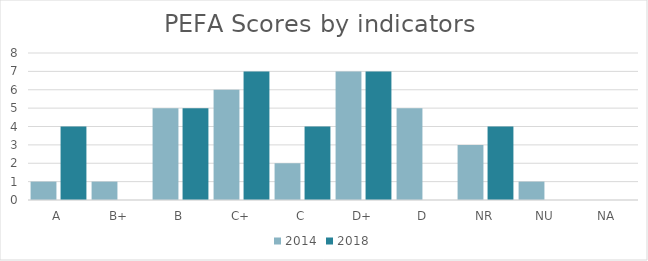
| Category | 2014 | 2018 |
|---|---|---|
| A | 1 | 4 |
| B+ | 1 | 0 |
| B | 5 | 5 |
| C+ | 6 | 7 |
| C | 2 | 4 |
| D+ | 7 | 7 |
| D | 5 | 0 |
| NR | 3 | 4 |
| NU | 1 | 0 |
| NA | 0 | 0 |